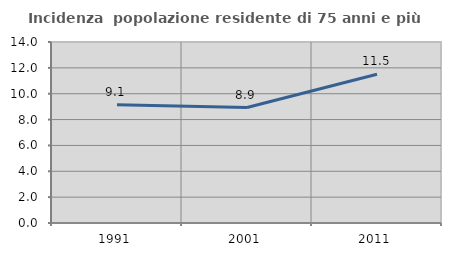
| Category | Incidenza  popolazione residente di 75 anni e più |
|---|---|
| 1991.0 | 9.147 |
| 2001.0 | 8.929 |
| 2011.0 | 11.505 |